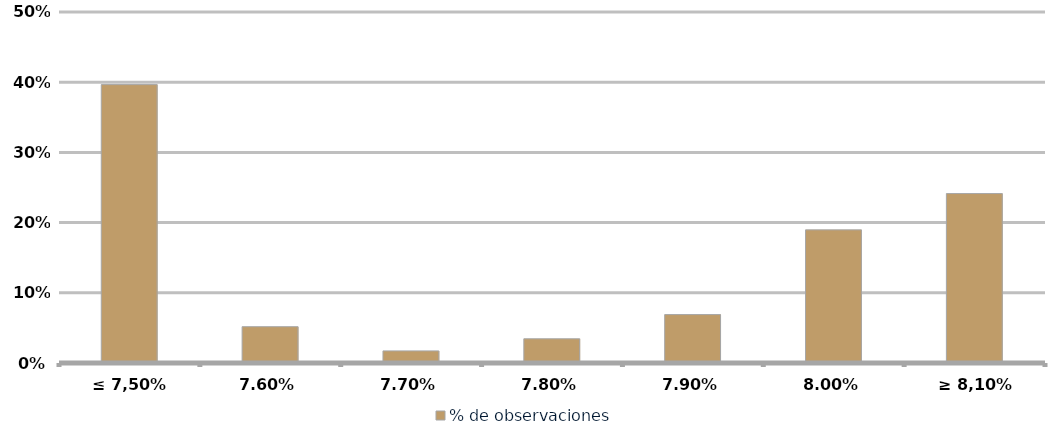
| Category | % de observaciones  |
|---|---|
| ≤ 7,50% | 0.397 |
| 7,60% | 0.052 |
| 7,70% | 0.017 |
| 7,80% | 0.034 |
| 7,90% | 0.069 |
| 8,00% | 0.19 |
| ≥ 8,10% | 0.241 |